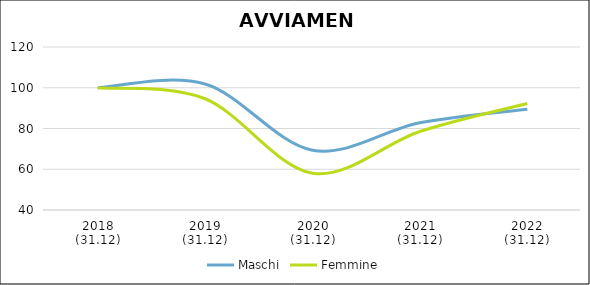
| Category | Maschi | Femmine |
|---|---|---|
| 2018
(31.12) | 100 | 100 |
| 2019
(31.12) | 101.849 | 94.6 |
| 2020
(31.12) | 69.359 | 58.012 |
| 2021
(31.12) | 82.796 | 78.544 |
| 2022
(31.12) | 89.498 | 92.306 |